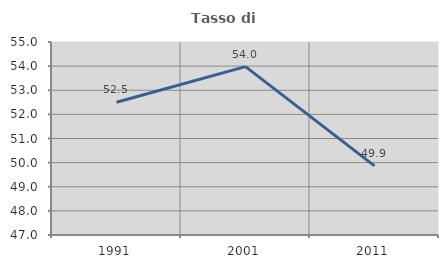
| Category | Tasso di occupazione   |
|---|---|
| 1991.0 | 52.5 |
| 2001.0 | 53.981 |
| 2011.0 | 49.867 |